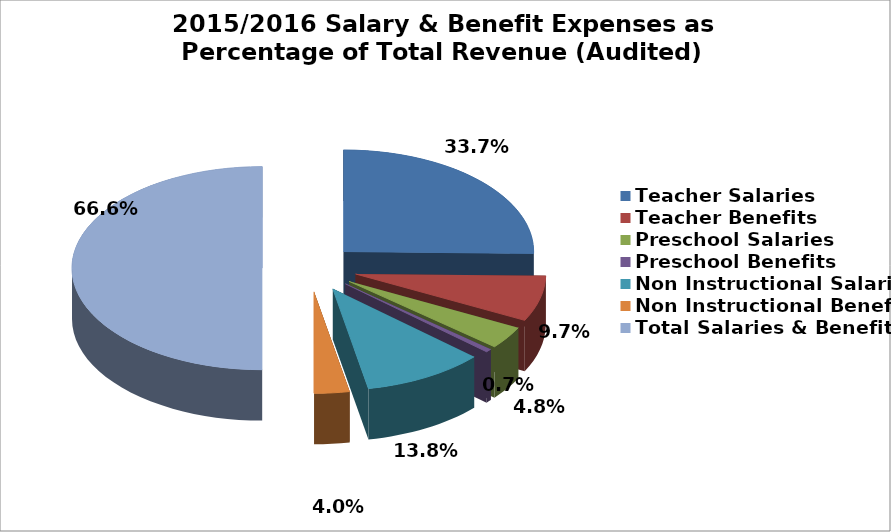
| Category | Series 0 |
|---|---|
| Teacher Salaries | 0.337 |
| Teacher Benefits | 0.097 |
| Preschool Salaries | 0.048 |
| Preschool Benefits | 0.007 |
| Non Instructional Salaries | 0.138 |
| Non Instructional Benefits | 0.04 |
| Total Salaries & Benefits | 0.666 |